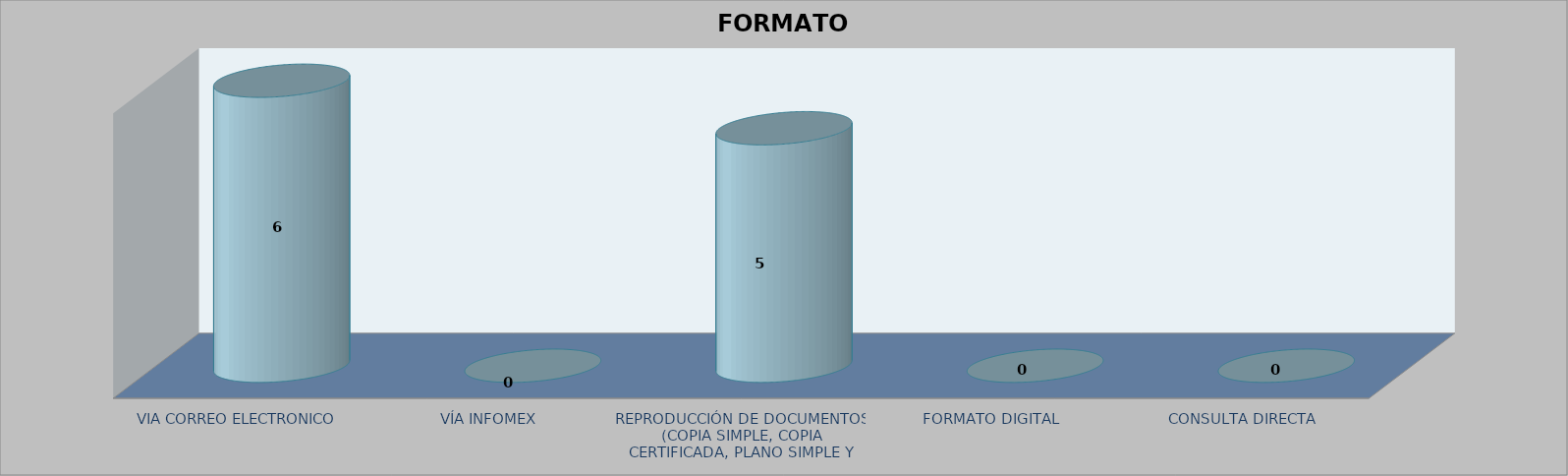
| Category |        FORMATO SOLICITADO | Series 1 | Series 2 |
|---|---|---|---|
| VIA CORREO ELECTRONICO |  |  | 6 |
| VÍA INFOMEX |  |  | 0 |
| REPRODUCCIÓN DE DOCUMENTOS (COPIA SIMPLE, COPIA CERTIFICADA, PLANO SIMPLE Y PLANO CERTIFICADO) |  |  | 5 |
| FORMATO DIGITAL |  |  | 0 |
| CONSULTA DIRECTA |  |  | 0 |